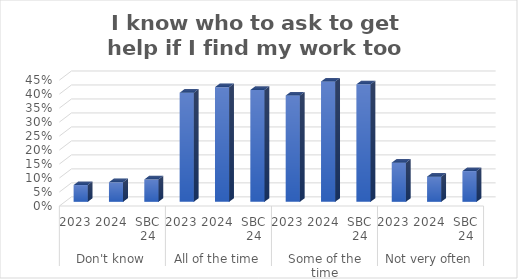
| Category | I know who to ask to get help if I find my work too hard. |
|---|---|
| 0 | 0.06 |
| 1 | 0.07 |
| 2 | 0.08 |
| 3 | 0.39 |
| 4 | 0.41 |
| 5 | 0.4 |
| 6 | 0.38 |
| 7 | 0.43 |
| 8 | 0.42 |
| 9 | 0.14 |
| 10 | 0.09 |
| 11 | 0.11 |